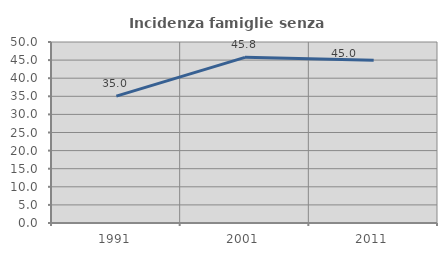
| Category | Incidenza famiglie senza nuclei |
|---|---|
| 1991.0 | 35.043 |
| 2001.0 | 45.763 |
| 2011.0 | 44.954 |